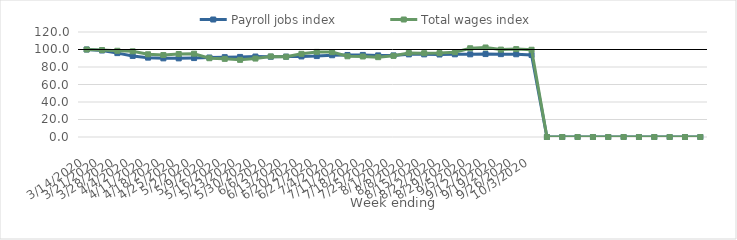
| Category | Payroll jobs index | Total wages index |
|---|---|---|
| 14/03/2020 | 100 | 100 |
| 21/03/2020 | 98.872 | 99.364 |
| 28/03/2020 | 95.867 | 98.547 |
| 04/04/2020 | 92.647 | 97.896 |
| 11/04/2020 | 90.699 | 94.553 |
| 18/04/2020 | 89.883 | 93.645 |
| 25/04/2020 | 89.864 | 94.842 |
| 02/05/2020 | 90.208 | 95.204 |
| 09/05/2020 | 90.849 | 90.049 |
| 16/05/2020 | 91.25 | 89.306 |
| 23/05/2020 | 91.509 | 88.167 |
| 30/05/2020 | 91.956 | 89.646 |
| 06/06/2020 | 91.726 | 92.078 |
| 13/06/2020 | 91.87 | 91.693 |
| 20/06/2020 | 92.08 | 95.036 |
| 27/06/2020 | 92.484 | 97.242 |
| 04/07/2020 | 93.431 | 97.018 |
| 11/07/2020 | 93.737 | 92.25 |
| 18/07/2020 | 93.821 | 92.03 |
| 25/07/2020 | 93.269 | 91.235 |
| 01/08/2020 | 93.241 | 92.749 |
| 08/08/2020 | 94.436 | 96.05 |
| 15/08/2020 | 94.443 | 95.768 |
| 22/08/2020 | 94.282 | 95.862 |
| 29/08/2020 | 94.516 | 96.94 |
| 05/09/2020 | 94.492 | 101.421 |
| 12/09/2020 | 94.784 | 102.289 |
| 19/09/2020 | 94.684 | 99.888 |
| 26/09/2020 | 94.563 | 100.439 |
| 03/10/2020 | 93.745 | 99.698 |